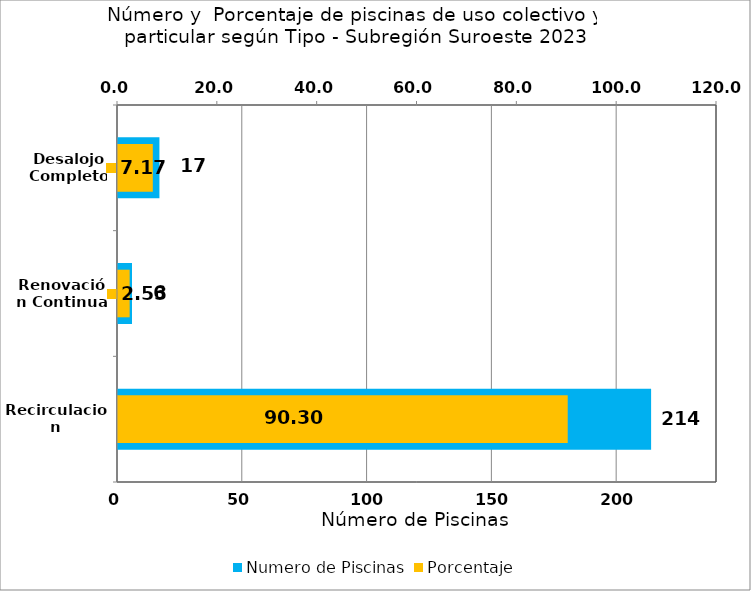
| Category | Numero de Piscinas |
|---|---|
| Recirculacion | 214 |
| Renovación Continua | 6 |
| Desalojo Completo | 17 |